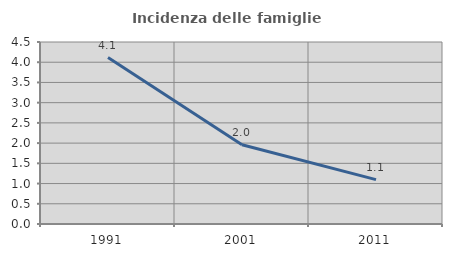
| Category | Incidenza delle famiglie numerose |
|---|---|
| 1991.0 | 4.115 |
| 2001.0 | 1.958 |
| 2011.0 | 1.096 |